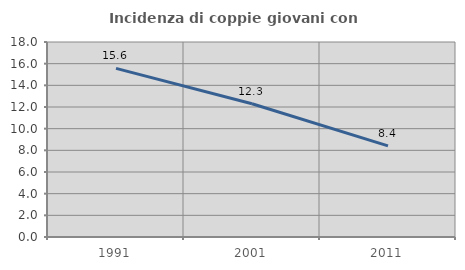
| Category | Incidenza di coppie giovani con figli |
|---|---|
| 1991.0 | 15.569 |
| 2001.0 | 12.295 |
| 2011.0 | 8.416 |